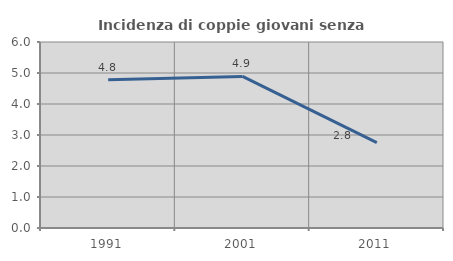
| Category | Incidenza di coppie giovani senza figli |
|---|---|
| 1991.0 | 4.783 |
| 2001.0 | 4.889 |
| 2011.0 | 2.752 |